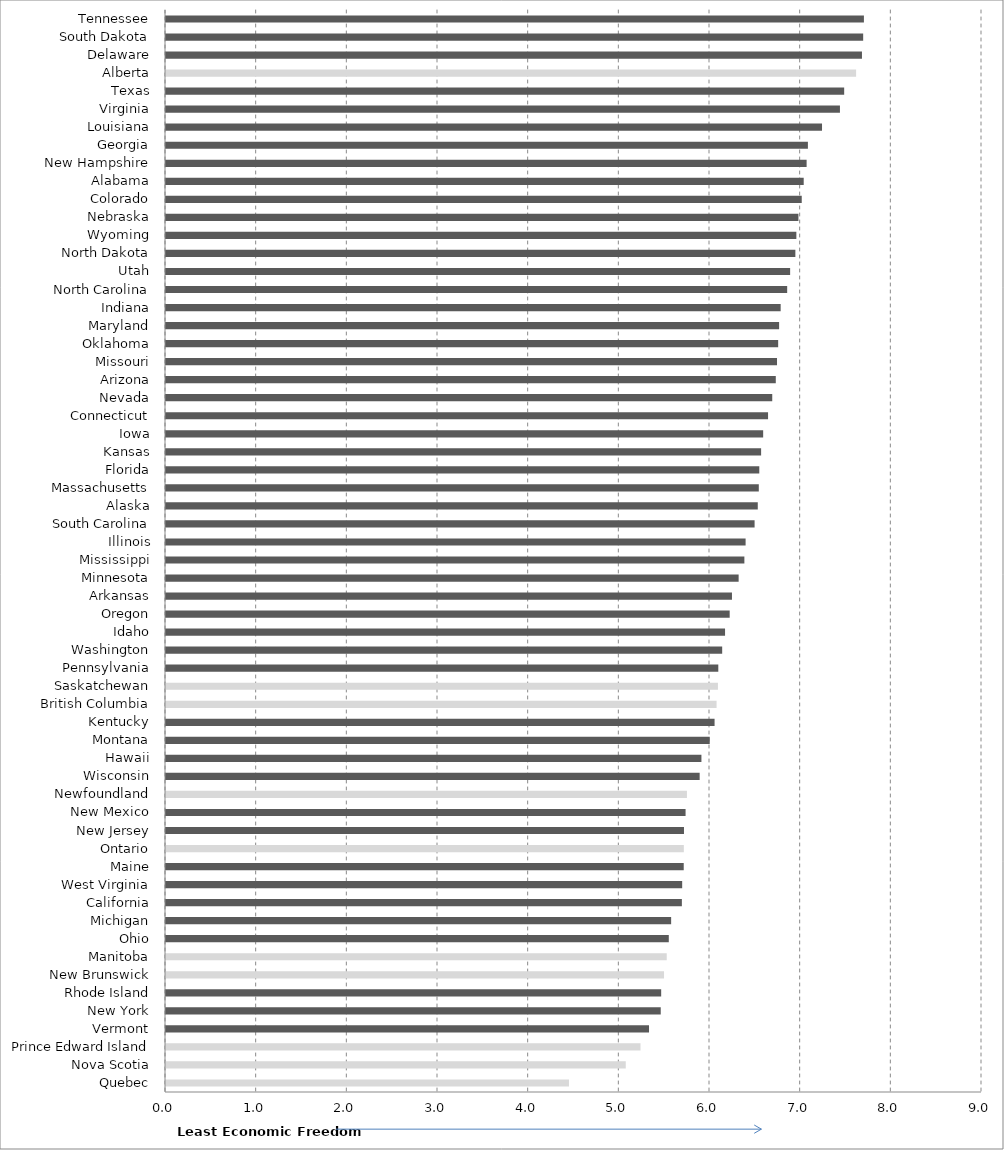
| Category | Series 0 |
|---|---|
| Quebec | 4.444 |
| Nova Scotia | 5.071 |
| Prince Edward Island | 5.233 |
| Vermont | 5.327 |
| New York | 5.457 |
| Rhode Island | 5.462 |
| New Brunswick | 5.493 |
| Manitoba | 5.523 |
| Ohio | 5.545 |
| Michigan | 5.571 |
| California | 5.69 |
| West Virginia | 5.693 |
| Maine | 5.71 |
| Ontario | 5.711 |
| New Jersey | 5.713 |
| New Mexico | 5.731 |
| Newfoundland | 5.746 |
| Wisconsin | 5.886 |
| Hawaii | 5.905 |
| Montana | 5.997 |
| Kentucky | 6.05 |
| British Columbia | 6.073 |
| Saskatchewan | 6.087 |
| Pennsylvania | 6.092 |
| Washington | 6.134 |
| Idaho | 6.166 |
| Oregon | 6.217 |
| Arkansas | 6.242 |
| Minnesota | 6.316 |
| Mississippi | 6.379 |
| Illinois | 6.393 |
| South Carolina | 6.492 |
| Alaska | 6.527 |
| Massachusetts | 6.538 |
| Florida | 6.544 |
| Kansas | 6.564 |
| Iowa | 6.586 |
| Connecticut | 6.64 |
| Nevada | 6.687 |
| Arizona | 6.726 |
| Missouri | 6.739 |
| Oklahoma | 6.752 |
| Maryland | 6.762 |
| Indiana | 6.779 |
| North Carolina | 6.851 |
| Utah | 6.884 |
| North Dakota | 6.942 |
| Wyoming | 6.952 |
| Nebraska | 6.975 |
| Colorado | 7.012 |
| Alabama | 7.034 |
| New Hampshire | 7.066 |
| Georgia | 7.08 |
| Louisiana | 7.236 |
| Virginia | 7.433 |
| Texas | 7.48 |
| Alberta | 7.611 |
| Delaware | 7.676 |
| South Dakota | 7.689 |
| Tennessee | 7.698 |